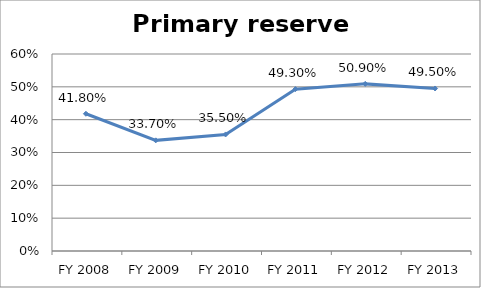
| Category | Primary reserve ratio |
|---|---|
| FY 2013 | 0.495 |
| FY 2012 | 0.509 |
| FY 2011 | 0.493 |
| FY 2010 | 0.355 |
| FY 2009 | 0.337 |
| FY 2008 | 0.418 |